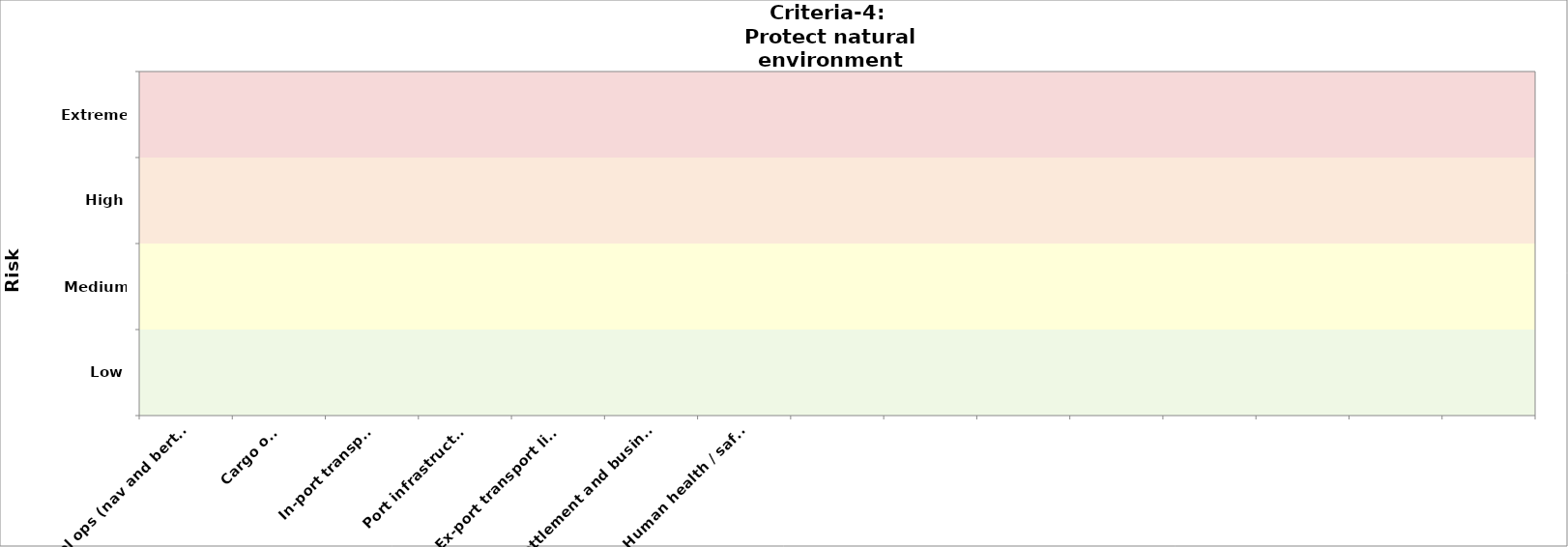
| Category | Criteria-3 (public health) | Criteria-4 
2050 |
|---|---|---|
| Vessel ops (nav and berthing) |  | 0 |
| Cargo ops |  | 0 |
| In-port transport |  | 0 |
| Port infrastructure |  | 0 |
| Ex-port transport links |  | 0 |
| Ex-port settlement and businesses |  | 0 |
| Human health / safety  |  | 0 |